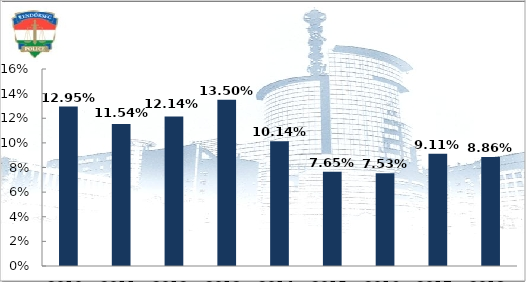
| Category | Ittasan okozott személysérüléses közúti közlekedési balesetek aránya (%) |
|---|---|
| 2010. év | 0.129 |
| 2011. év | 0.115 |
| 2012. év | 0.121 |
| 2013. év | 0.135 |
| 2014. év | 0.101 |
| 2015. év | 0.076 |
| 2016. év | 0.075 |
| 2017. év | 0.091 |
| 2018. év | 0.089 |